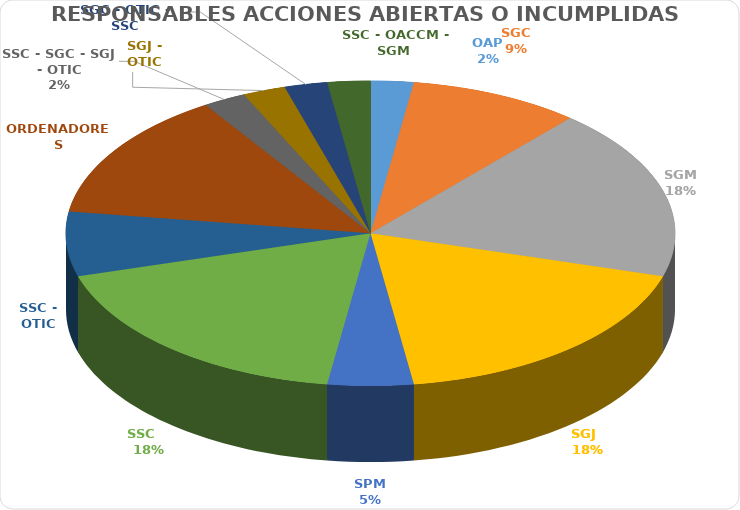
| Category | Series 0 |
|---|---|
| OAP | 1 |
| SGC | 4 |
| SGM | 8 |
| SGJ   | 8 |
| SPM | 2 |
| SSC    | 8 |
| SSC - OTIC | 3 |
| ORDENADORES | 6 |
| SSC - SGC - SGJ - OTIC | 1 |
| SGJ - OTIC | 1 |
| SGC - OTIC - SSC | 1 |
| SSC - OACCM - SGM  | 1 |